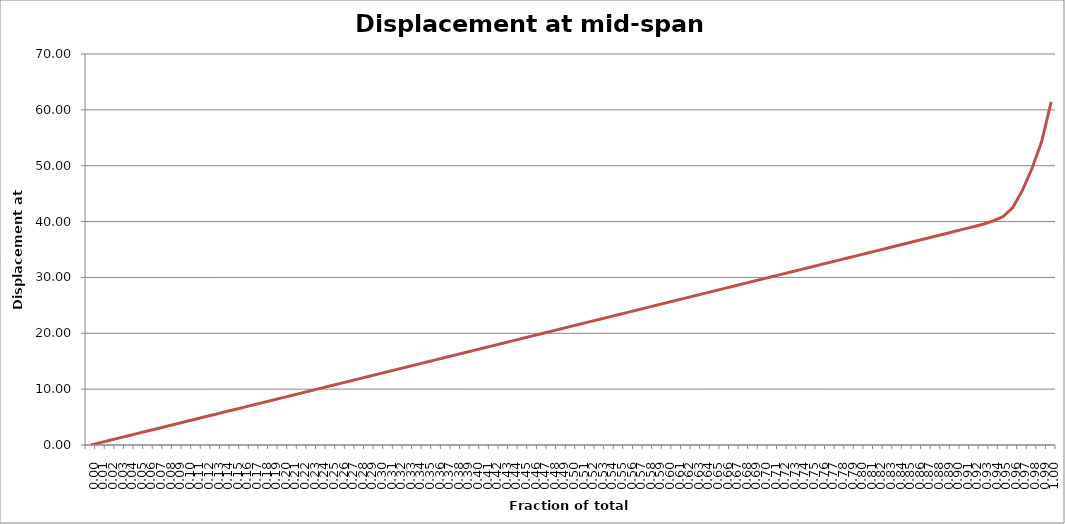
| Category | Displacement at mid-span [mm] |
|---|---|
| 0.0 | 0 |
| 0.01 | 0.424 |
| 0.02 | 0.848 |
| 0.03 | 1.272 |
| 0.04 | 1.696 |
| 0.05 | 2.12 |
| 0.06 | 2.544 |
| 0.06999999999999999 | 2.968 |
| 0.08 | 3.393 |
| 0.09 | 3.817 |
| 0.1 | 4.241 |
| 0.11000000000000001 | 4.665 |
| 0.12 | 5.09 |
| 0.13 | 5.514 |
| 0.13999999999999999 | 5.938 |
| 0.15 | 6.363 |
| 0.16 | 6.787 |
| 0.16999999999999998 | 7.212 |
| 0.18 | 7.636 |
| 0.19 | 8.06 |
| 0.2 | 8.485 |
| 0.21000000000000002 | 8.909 |
| 0.22000000000000003 | 9.334 |
| 0.22999999999999998 | 9.758 |
| 0.24 | 10.183 |
| 0.25 | 10.608 |
| 0.26 | 11.032 |
| 0.27 | 11.457 |
| 0.27999999999999997 | 11.882 |
| 0.29 | 12.306 |
| 0.3 | 12.731 |
| 0.31 | 13.156 |
| 0.32 | 13.581 |
| 0.32999999999999996 | 14.006 |
| 0.33999999999999997 | 14.43 |
| 0.35 | 14.855 |
| 0.36 | 15.28 |
| 0.37 | 15.705 |
| 0.38 | 16.13 |
| 0.39 | 16.555 |
| 0.4 | 16.98 |
| 0.41 | 17.405 |
| 0.42000000000000004 | 17.83 |
| 0.43 | 18.255 |
| 0.44000000000000006 | 18.68 |
| 0.45 | 19.105 |
| 0.45999999999999996 | 19.53 |
| 0.47000000000000003 | 19.955 |
| 0.48 | 20.381 |
| 0.49000000000000005 | 20.806 |
| 0.5 | 21.231 |
| 0.51 | 21.656 |
| 0.52 | 22.082 |
| 0.53 | 22.507 |
| 0.54 | 22.932 |
| 0.55 | 23.358 |
| 0.5599999999999999 | 23.783 |
| 0.5700000000000001 | 24.208 |
| 0.58 | 24.634 |
| 0.5900000000000001 | 25.059 |
| 0.6 | 25.485 |
| 0.61 | 25.91 |
| 0.62 | 26.336 |
| 0.63 | 26.761 |
| 0.64 | 27.187 |
| 0.65 | 27.612 |
| 0.6599999999999999 | 28.038 |
| 0.67 | 28.463 |
| 0.6799999999999999 | 28.889 |
| 0.6900000000000001 | 29.315 |
| 0.7 | 29.74 |
| 0.71 | 30.166 |
| 0.72 | 30.592 |
| 0.73 | 31.018 |
| 0.74 | 31.443 |
| 0.75 | 31.869 |
| 0.76 | 32.295 |
| 0.77 | 32.721 |
| 0.78 | 33.147 |
| 0.79 | 33.573 |
| 0.8 | 33.998 |
| 0.8099999999999999 | 34.424 |
| 0.82 | 34.85 |
| 0.8300000000000001 | 35.276 |
| 0.8400000000000001 | 35.702 |
| 0.85 | 36.128 |
| 0.86 | 36.554 |
| 0.8699999999999999 | 36.98 |
| 0.8800000000000001 | 37.407 |
| 0.89 | 37.833 |
| 0.9 | 38.259 |
| 0.9099999999999999 | 38.685 |
| 0.9199999999999999 | 39.112 |
| 0.93 | 39.576 |
| 0.9400000000000001 | 40.148 |
| 0.95 | 40.906 |
| 0.96 | 42.511 |
| 0.97 | 45.573 |
| 0.9800000000000001 | 49.49 |
| 0.99 | 54.277 |
| 1.0 | 61.438 |